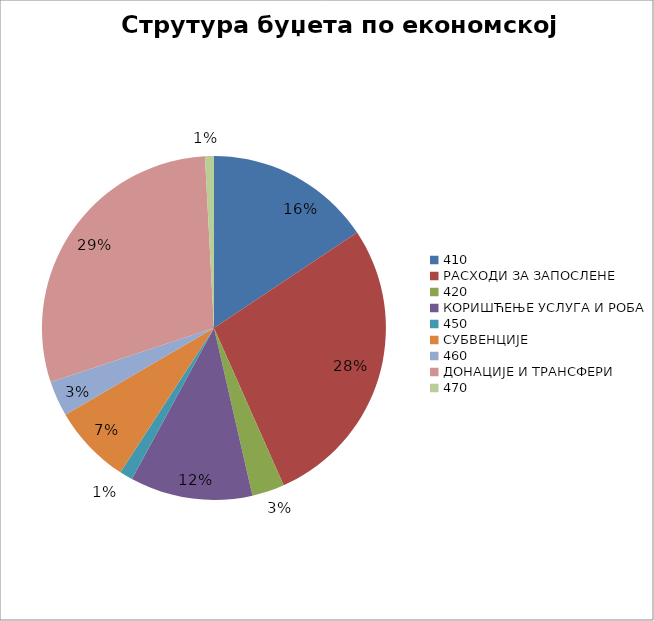
| Category | Series 0 |
|---|---|
| 0 | 130680000 |
| 1 | 231710000 |
| 2 | 25450000 |
| 3 | 96250000 |
| 4 | 10300000 |
| 5 | 62170359 |
| 6 | 27739641 |
| 7 | 244450000 |
| 8 | 7000000 |